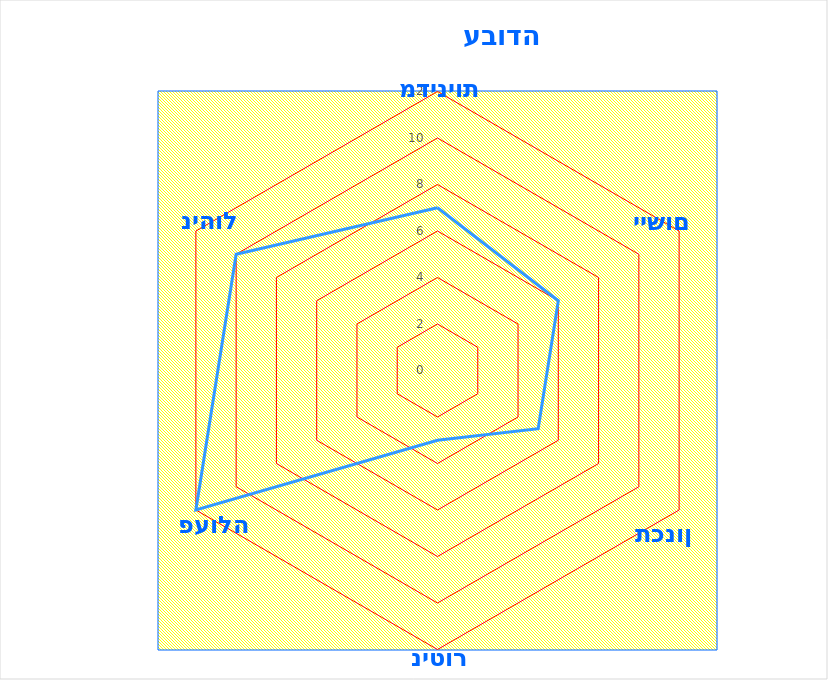
| Category | Series 0 |
|---|---|
| 0 | 7 |
| 1 | 6 |
| 2 | 5 |
| 3 | 3 |
| 4 | 12 |
| 5 | 10 |